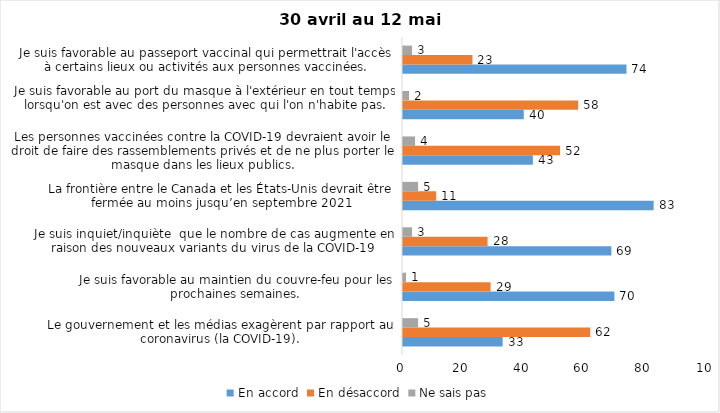
| Category | En accord | En désaccord | Ne sais pas |
|---|---|---|---|
| Le gouvernement et les médias exagèrent par rapport au coronavirus (la COVID-19). | 33 | 62 | 5 |
| Je suis favorable au maintien du couvre-feu pour les prochaines semaines. | 70 | 29 | 1 |
| Je suis inquiet/inquiète  que le nombre de cas augmente en raison des nouveaux variants du virus de la COVID-19 | 69 | 28 | 3 |
| La frontière entre le Canada et les États-Unis devrait être fermée au moins jusqu’en septembre 2021 | 83 | 11 | 5 |
| Les personnes vaccinées contre la COVID-19 devraient avoir le droit de faire des rassemblements privés et de ne plus porter le masque dans les lieux publics. | 43 | 52 | 4 |
| Je suis favorable au port du masque à l'extérieur en tout temps lorsqu'on est avec des personnes avec qui l'on n'habite pas. | 40 | 58 | 2 |
| Je suis favorable au passeport vaccinal qui permettrait l'accès à certains lieux ou activités aux personnes vaccinées. | 74 | 23 | 3 |